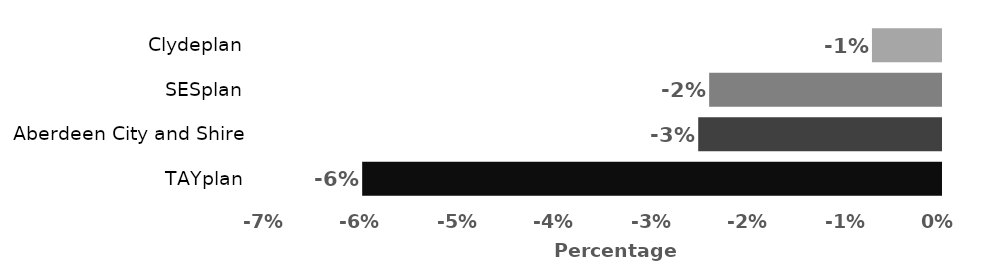
| Category | Percentage change |
|---|---|
| TAYplan | -5.967 |
| Aberdeen City and Shire | -2.503 |
| SESplan | -2.39 |
| Clydeplan | -0.712 |